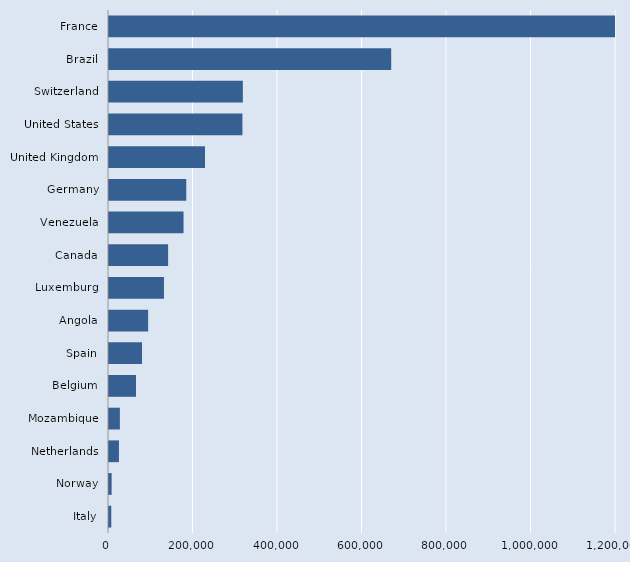
| Category | Series 0 |
|---|---|
| Italy | 5372 |
| Norway | 6200 |
| Netherlands | 23548 |
| Mozambique | 25739 |
| Belgium | 63965 |
| Spain | 78125 |
| Angola | 92666 |
| Luxemburg | 130134 |
| Canada | 139924 |
| Venezuela | 176428 |
| Germany | 182881 |
| United Kingdom | 227212 |
| United States | 315808 |
| Switzerland | 316832 |
| Brazil | 667928 |
| France | 1284196 |